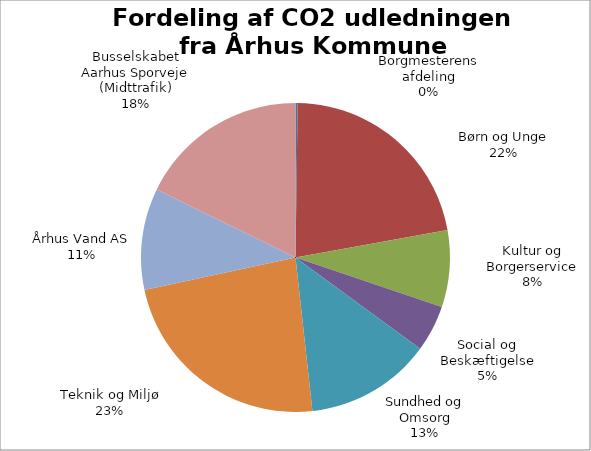
| Category | Ton CO2 | % af total |
|---|---|---|
| Borgmesterens afdeling | 219.07 | 0.224 |
| Børn og Unge | 21488.727 | 21.929 |
| Kultur og Borgerservice | 7890.314 | 8.052 |
| Social og Beskæftigelse | 4758.175 | 4.856 |
| Sundhed og Omsorg | 12925.643 | 13.19 |
| Teknik og Miljø | 22897.205 | 23.366 |
| Århus Vand AS | 10420.878 | 10.634 |
| Busselskabet Aarhus Sporveje (Midttrafik) | 17393.148 | 17.749 |